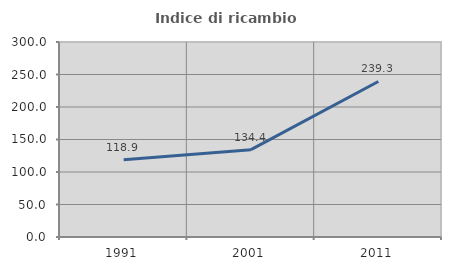
| Category | Indice di ricambio occupazionale  |
|---|---|
| 1991.0 | 118.878 |
| 2001.0 | 134.372 |
| 2011.0 | 239.29 |